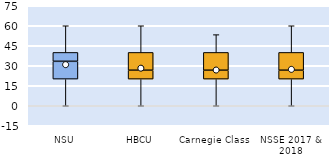
| Category | 25th | 50th | 75th |
|---|---|---|---|
| NSU | 20 | 13.333 | 6.667 |
| HBCU | 20 | 6.667 | 13.333 |
| Carnegie Class | 20 | 6.667 | 13.333 |
| NSSE 2017 & 2018 | 20 | 6.667 | 13.333 |